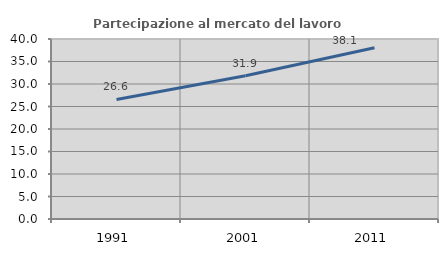
| Category | Partecipazione al mercato del lavoro  femminile |
|---|---|
| 1991.0 | 26.575 |
| 2001.0 | 31.851 |
| 2011.0 | 38.068 |